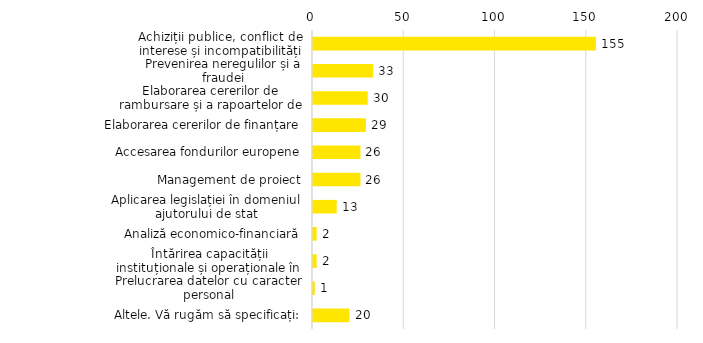
| Category | Series 0 |
|---|---|
| Achiziții publice, conflict de interese și incompatibilități | 155 |
| Prevenirea neregulilor și a fraudei | 33 |
| Elaborarea cererilor de rambursare și a rapoartelor de progres | 30 |
| Elaborarea cererilor de finanțare  | 29 |
| Accesarea fondurilor europene | 26 |
| Management de proiect | 26 |
| Aplicarea legislației în domeniul ajutorului de stat | 13 |
| Analiză economico-financiară | 2 |
| Întărirea capacității instituționale și operaționale în sectorul de apă și apă uzată | 2 |
| Prelucrarea datelor cu caracter personal | 1 |
| Altele. Vă rugăm să specificați: | 20 |